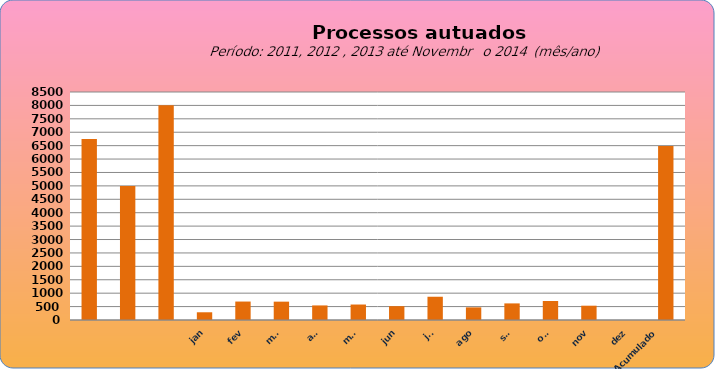
| Category | 6749 4998  8.003   288  688 684 543 577 516 867 471 619 708 533 0 |
|---|---|
|  | 6749 |
|  | 4998 |
|  | 8003 |
| jan | 288 |
| fev | 688 |
| mar | 684 |
| abr | 543 |
| mai | 577 |
| jun | 516 |
| jul | 867 |
| ago | 471 |
| set | 619 |
| out | 708 |
| nov | 533 |
| dez | 0 |
| Acumulado
 | 6483 |